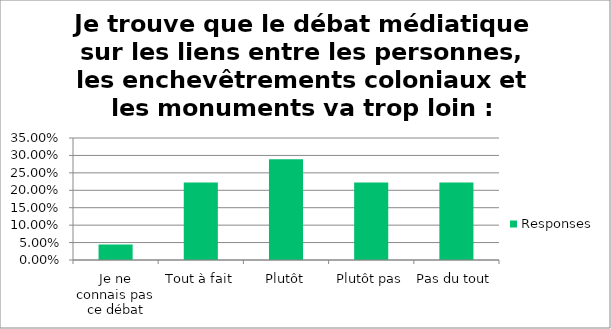
| Category | Responses |
|---|---|
| Je ne connais pas ce débat | 0.044 |
| Tout à fait | 0.222 |
| Plutôt | 0.289 |
| Plutôt pas | 0.222 |
| Pas du tout | 0.222 |